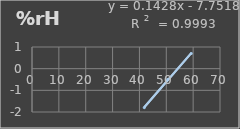
| Category | Humedad |
|---|---|
| 41.8 | -1.8 |
| 50.5 | -0.5 |
| 59.3 | 0.7 |